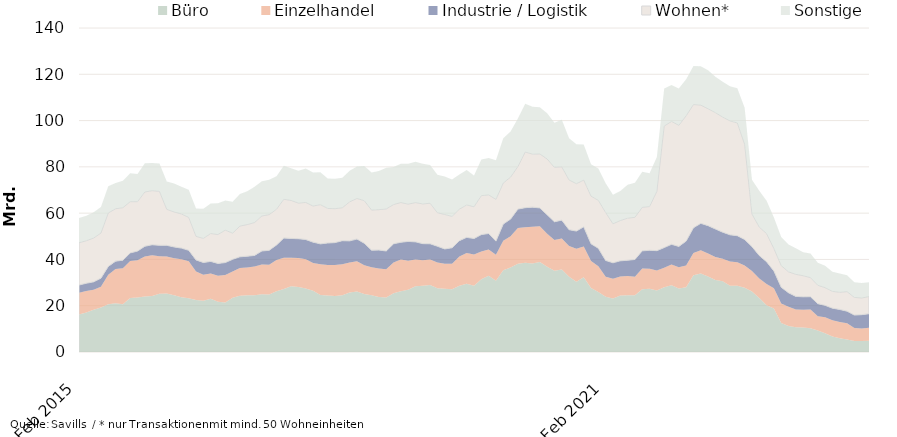
| Category | Büro | Einzelhandel | Industrie / Logistik | Wohnen* | Sonstige |
|---|---|---|---|---|---|
| 2015-02-01 | 16255290231.74 | 9372549053.81 | 3308490268.73 | 18255026522.91 | 10739371487.05 |
| 2015-03-01 | 17016358031.53 | 9334060176.81 | 3368654245.73 | 18361690467.91 | 10843377202.98 |
| 2015-04-01 | 18244972783.53 | 8600759739.81 | 3468694360.68 | 18935039794.91 | 11184131034.98 |
| 2015-05-01 | 19238000474.45 | 8936850539.31 | 3728635607.68 | 19506582676.91 | 11229798527.98 |
| 2015-06-01 | 20614824085.83 | 12804218553.14 | 3559231021.83 | 23077039312.51 | 11574720193.75 |
| 2015-07-01 | 21080237533.5 | 14814698989.21 | 3371725415.86 | 22644697118.35 | 11143910205.21 |
| 2015-08-01 | 20656625633.5 | 15562941505.21 | 3450767146.86 | 22691607883.35 | 11626767372.21 |
| 2015-09-01 | 23302273453.46 | 16001092585.73 | 3520511283.36 | 22121631489.35 | 12279196997.21 |
| 2015-10-01 | 23501772857.46 | 16181040556.36 | 3919085482.36 | 21349455176.35 | 11987539478.21 |
| 2015-11-01 | 23957423619.14 | 17339041737.5 | 4397719316.13 | 23451887702.29 | 12443601394.38 |
| 2015-12-01 | 24202213697.48 | 17587198961.04 | 4557113724.92 | 23375825542.77 | 11975940305.75 |
| 2016-01-01 | 25139700628.48 | 16270997225.45 | 4662502872.92 | 23334161447.77 | 12028959045.24 |
| 2016-02-01 | 25294714349.53 | 15952090497.99 | 4833139363.87 | 15563498654.77 | 12008953720.01 |
| 2016-03-01 | 24534844202.74 | 15997699828.72 | 4877967507.07 | 15108592339.77 | 12318880326.08 |
| 2016-04-01 | 23667928105.74 | 16386770286.07 | 4833846127.82 | 14760671477.37 | 11756957541.08 |
| 2016-05-01 | 23251081507.82 | 15941944380.07 | 4749671116.82 | 14232081715.37 | 11979556735.04 |
| 2016-06-01 | 22424129844.36 | 12364494883.06 | 4999570420.67 | 10189436595.87 | 12067576140.06 |
| 2016-07-01 | 22113990925.69 | 11257435985.56 | 5312245465.64 | 10404072475.53 | 12817090834.96 |
| 2016-08-01 | 23020503074.69 | 10878738868.56 | 5247332254.55 | 12050427222.53 | 12924367433.96 |
| 2016-09-01 | 21721152253.73 | 11278501725.47 | 5270185116.55 | 12498985369.53 | 13466325785.26 |
| 2016-10-01 | 21376679446.86 | 11872308168.84 | 5398267322.55 | 14009495152.42 | 12815064855.83 |
| 2016-11-01 | 23418913086.76 | 11371816740.7 | 5243284144.73 | 11319606979.49 | 13584628478.66 |
| 2016-12-01 | 24311240228.4 | 11942470429.99 | 4890351002.13 | 13270662270.49 | 13860642419.64 |
| 2017-01-01 | 24509608793.4 | 11953863686.96 | 4924744810.37 | 13669156871.49 | 14439441490.58 |
| 2017-02-01 | 24522929822.41 | 12378572437.09 | 4842785725 | 14207318507.49 | 15399823383.58 |
| 2017-03-01 | 24979801711.4 | 12787832178.37 | 5899654543.8 | 15107380846.79 | 14961863124.58 |
| 2017-04-01 | 24819990861.71 | 12853010576.9 | 6262060580.1 | 15428575157.19 | 15066124285.67 |
| 2017-05-01 | 26232596283.47 | 13514985630.15 | 6483702097.1 | 15461747545.2 | 14297593389.28 |
| 2017-06-01 | 27213166704.1 | 13474043478.5 | 8562546401.46 | 16748341270.79 | 14470141007.56 |
| 2017-07-01 | 28420051498.1 | 12322239347.93 | 8324132158.46 | 16426846580.79 | 13950696505.2 |
| 2017-08-01 | 28135534177.1 | 12429029136.93 | 8386695707.55 | 15389020182.79 | 13979801046.2 |
| 2017-09-01 | 27443892685.45 | 12637830917.94 | 8510058041.55 | 16036484989.78 | 14628427847.74 |
| 2017-10-01 | 26496035870.32 | 11930960273.94 | 9048046430.46 | 15587099126.87 | 14494347450.17 |
| 2017-11-01 | 24585217292.17 | 13335421843.83 | 8802947546.51 | 16954725036.87 | 13991797246.44 |
| 2017-12-01 | 24440717997.53 | 13186078236.48 | 9470343512.7 | 14947735472.87 | 12875205655.48 |
| 2018-01-01 | 24169632440.53 | 13385637745.1 | 9721702683.46 | 14644481680.86 | 12965625420.04 |
| 2018-02-01 | 24532655677.47 | 13346974130.65 | 10213193365.46 | 14254040308.86 | 12991286516.04 |
| 2018-03-01 | 25689146433.48 | 13025014136.64 | 9307934893.46 | 16861797743.49 | 13423676924.02 |
| 2018-04-01 | 26121570226.17 | 13083782210.76 | 9605919650.46 | 17541166648.49 | 13812859535.93 |
| 2018-05-01 | 25059149940.41 | 12454100846.51 | 9488564046.46 | 18390492426.48 | 14988664801.36 |
| 2018-06-01 | 24502115752.78 | 12171900363.34 | 7330050155.1 | 17324340647.56 | 16180804689.08 |
| 2018-07-01 | 23768042590.78 | 12322300226.32 | 7966869588.1 | 17450608751.56 | 16672007493.19 |
| 2018-08-01 | 23510045994.76 | 12247139005.19 | 7892000709.1 | 18148274126.41 | 17798374873.04 |
| 2018-09-01 | 25341157455.41 | 13289291079.55 | 8129841438.1 | 16962704659.42 | 16165594775.21 |
| 2018-10-01 | 26253931201.41 | 13760202882.82 | 7406435586.25 | 17174676866.32 | 16705006538.21 |
| 2018-11-01 | 26888009103.45 | 12507346034.88 | 8394898728.54 | 16108073420.32 | 17423267492.25 |
| 2018-12-01 | 28411133671.45 | 11512722354.68 | 7666795490.35 | 16973956914.32 | 17659710774.26 |
| 2019-01-01 | 28624375832.45 | 10984616615.68 | 7214323719.35 | 17160274095.2 | 17313329869.26 |
| 2019-02-01 | 28937833501.45 | 10992187442.4 | 6831262259.96 | 17513522042.2 | 16557159059.62 |
| 2019-03-01 | 27544432810.45 | 11171202657.26 | 6985219187.16 | 14474272923.27 | 16426926447.64 |
| 2019-04-01 | 27372510768.31 | 10721779269.12 | 6436402186.06 | 14889885528.14 | 16464762534.89 |
| 2019-05-01 | 27086717264.31 | 11007377577.12 | 6927571752.06 | 13578486873.14 | 15944373230.89 |
| 2019-06-01 | 28619667307.82 | 12681145920.09 | 6809920057.06 | 13618351757.47 | 14918333741.96 |
| 2019-07-01 | 29482520307.29 | 13328276761.26 | 6728675032.06 | 14001371322.47 | 15123984896.92 |
| 2019-08-01 | 28588686723.31 | 13581005313.39 | 6860393893.06 | 13736815812.62 | 13482843208.07 |
| 2019-09-01 | 31431753528.25 | 12033999494.97 | 7256389082.92 | 16844554255.62 | 15592958025.83 |
| 2019-10-01 | 32996593890.25 | 11314584887.7 | 6895687562.55 | 16686604858.74 | 15889399476.83 |
| 2019-11-01 | 30747652297.78 | 11283623755.75 | 5893842897.79 | 18035429153.74 | 16938532442.52 |
| 2019-12-01 | 35333825929.49 | 12729233930.88 | 7226755920.45 | 17719972058.74 | 19305302136.48 |
| 2020-01-01 | 36531141461.49 | 13436003498.88 | 7453434361.23 | 18157224812.87 | 19678778754.48 |
| 2020-02-01 | 38099058525.44 | 15499382207.37 | 8153950247.38 | 18363765931.37 | 20828827891.2 |
| 2020-03-01 | 38550852731.89 | 15348353698.15 | 8470739173.18 | 24050048197.37 | 20802783298.78 |
| 2020-04-01 | 38270850851.03 | 15863227930.17 | 8454767344.28 | 22908106646.5 | 20458776349.53 |
| 2020-05-01 | 38881659487.03 | 15503798044.17 | 7865864944.28 | 23336096487.5 | 20137314225.49 |
| 2020-06-01 | 36863967238.52 | 14249892871.21 | 8180845859.28 | 24099048462.5 | 19760014318.42 |
| 2020-07-01 | 35100846656.05 | 13289221607.06 | 7897157112.28 | 23512544941.5 | 19250334168.72 |
| 2020-08-01 | 35666705693.05 | 13410315043.06 | 7903742159.28 | 23019438157.5 | 20371509500.21 |
| 2020-09-01 | 32548010965.11 | 13308117743.68 | 6993249103.42 | 21488103702.49 | 18050626536.08 |
| 2020-10-01 | 30377863654.11 | 14232141322.68 | 7652755535.73 | 20471023725.49 | 17086798953.54 |
| 2020-11-01 | 32272707606.11 | 13317837196.68 | 8500880007.2 | 20188542385.49 | 15400933573.98 |
| 2020-12-01 | 27625165021.4 | 11665823550.74 | 7453393031.54 | 20611432435.49 | 13802815932.88 |
| 2021-01-01 | 25922292644.4 | 11086279196.74 | 7788343257.76 | 20716309315.49 | 13816564859.79 |
| 2021-02-01 | 23909270226.45 | 8616945364.53 | 7050296261 | 20712784697.99 | 12611658548.47 |
| 2021-03-01 | 23103754308 | 8542709511.89 | 6901126684.99 | 16854834848.99 | 12571457775.25 |
| 2021-04-01 | 24445734490 | 8172892560.01 | 6780450405.99 | 17402809013.99 | 12787391550.25 |
| 2021-05-01 | 24556778258 | 8300675545.01 | 6799570666.99 | 18167126016.99 | 14426521004.29 |
| 2021-06-01 | 24564712115 | 7976784992 | 7442419746.99 | 18226182212.99 | 14893365800.91 |
| 2021-07-01 | 27096908880 | 8946495241 | 7685665984.99 | 18785811487.74 | 15380416702.54 |
| 2021-08-01 | 27381485355 | 8588029166 | 7973074710.96 | 18901381563.74 | 14374250615.05 |
| 2021-09-01 | 26583833618 | 8673767815.91 | 8545495709.96 | 25629322018.75 | 14806322793.41 |
| 2021-10-01 | 27976146105.69 | 8385660425.91 | 8750582399.96 | 52501286139.75 | 16203607137.32 |
| 2021-11-01 | 28869809103.69 | 8903617601.91 | 8755552913.96 | 53116738980.75 | 15682010779.88 |
| 2021-12-01 | 27486490912.69 | 9091146920.86 | 9058724684.96 | 52306052488.25 | 15911718226.98 |
| 2022-01-01 | 28031135110.69 | 9315774980.07 | 10564640071.97 | 54152314759.25 | 15815971210.07 |
| 2022-02-01 | 33207067958.24 | 9592118324.13 | 10884960143.97 | 53241290616.79 | 16686139999.17 |
| 2022-03-01 | 33946785395.27 | 10065682922.43 | 11570573114.93 | 51107123050.79 | 16747285170.48 |
| 2022-04-01 | 32664499595.27 | 9945157957.43 | 11993854151.93 | 50503999418.79 | 16663945475.48 |
| 2022-05-01 | 31125193747.27 | 9878526536.43 | 12156046280.93 | 50270647458.79 | 15528955696.48 |
| 2022-06-01 | 30599994788.74 | 9654726857.42 | 11522419839.93 | 49707368541.79 | 15318436387.32 |
| 2022-07-01 | 28678258351.74 | 10395369164.8 | 11552338908.93 | 49231995043.04 | 15001577672.32 |
| 2022-08-01 | 28623980028.74 | 10186491398.8 | 11445785093.96 | 48711417034.02 | 15034757196.32 |
| 2022-09-01 | 27784288953.74 | 9632330188.89 | 11196978657.96 | 41148135072.17 | 15807249733.27 |
| 2022-10-01 | 26111579119.05 | 8901542364.89 | 10532370813.96 | 14109575596.17 | 14768461087.88 |
| 2022-11-01 | 23352831057.49 | 8443326908.89 | 9881801612.96 | 12298496042.17 | 15703391925.8 |
| 2022-12-01 | 20211163559.49 | 9142239345.94 | 9652007449.94 | 12150611492.67 | 14213710249.84 |
| 2023-01-01 | 18780895172.49 | 8725890743.73 | 7496504559.93 | 9699649565.65 | 13438092380.84 |
| 2023-02-01 | 12490315896.94 | 8415580292.67 | 7078973358.93 | 9335553360.11 | 12415537026.98 |
| 2023-03-01 | 11256081460.91 | 8315769799.37 | 6010959284.98 | 9054825734.11 | 11772448192.31 |
| 2023-04-01 | 10683362085.91 | 7669193635.37 | 5665394287.98 | 9530698016.53 | 11251023541.31 |
| 2023-05-01 | 10633502484.91 | 7617749199.37 | 5603325227.98 | 9108479222.53 | 10182066550.31 |
| 2023-06-01 | 10294412987.44 | 8019269018.37 | 5581733960.95 | 8245407543.53 | 10394155264.85 |
| 2023-07-01 | 9257206588.44 | 6155683000.99 | 5472679568.92 | 7958623413.29 | 9679839564.85 |
| 2023-08-01 | 8110622411.44 | 6920486354.29 | 5117810292.92 | 7641044836.31 | 9432500533.85 |
| 2023-09-01 | 6677025956.44 | 7025893837.29 | 5231318723.92 | 7259636172.16 | 8535649969.9 |
| 2023-10-01 | 5989961773.44 | 6976884473.29 | 5411649029.9 | 7420197986.16 | 8096481202.92 |
| 2023-11-01 | 5446695337 | 6964054881.29 | 5232888564.9 | 8430875484.01 | 7111618592 |
| 2023-12-01 | 4707152857 | 5668532896.29 | 5573283565.87 | 7641925882.01 | 6582967199 |
| 2024-01-01 | 4774437246 | 5421403017.29 | 5944308304.87 | 7198308534.03 | 6475551233 |
| 2024-02-01 | 4829343174 | 5619831153.29 | 6090721924.87 | 7430337592.03 | 6117703233 |